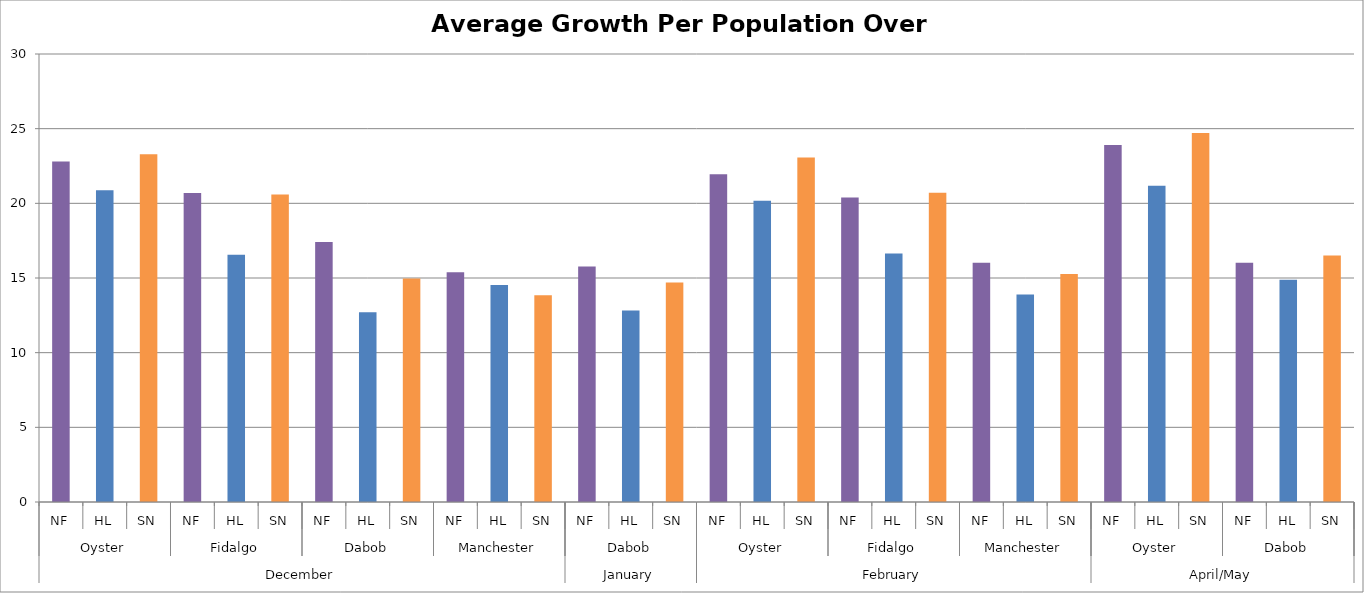
| Category | Growth |
|---|---|
| 0 | 22.8 |
| 1 | 20.875 |
| 2 | 23.281 |
| 3 | 20.688 |
| 4 | 16.562 |
| 5 | 20.594 |
| 6 | 17.419 |
| 7 | 12.712 |
| 8 | 14.96 |
| 9 | 15.387 |
| 10 | 14.531 |
| 11 | 13.844 |
| 12 | 15.77 |
| 13 | 12.83 |
| 14 | 14.7 |
| 15 | 21.941 |
| 16 | 20.181 |
| 17 | 23.067 |
| 18 | 20.389 |
| 19 | 16.634 |
| 20 | 20.713 |
| 21 | 16.021 |
| 22 | 13.894 |
| 23 | 15.27 |
| 24 | 23.909 |
| 25 | 21.18 |
| 26 | 24.712 |
| 27 | 16.024 |
| 28 | 14.888 |
| 29 | 16.502 |